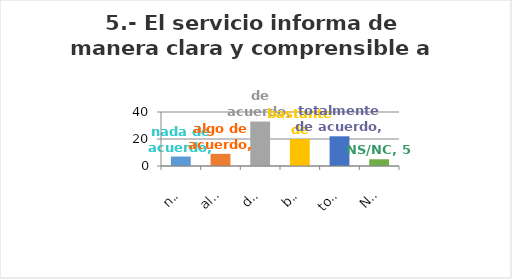
| Category | Series 0 |
|---|---|
| nada de acuerdo | 7 |
| algo de acuerdo | 9 |
| de acuerdo | 33 |
| bastante de acuerdo | 20 |
| totalmente de acuerdo | 22 |
| NS/NC | 5 |